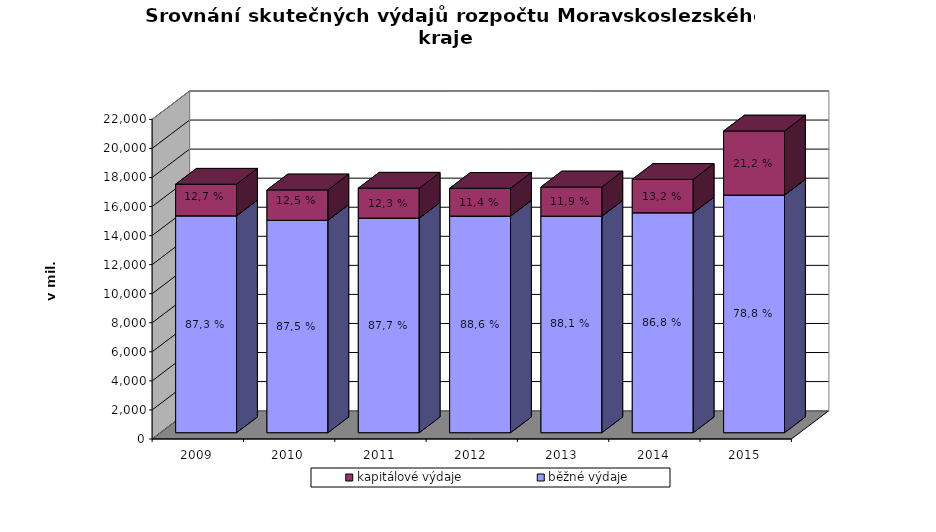
| Category | běžné výdaje | kapitálové výdaje |
|---|---|---|
| 2009.0 | 14927.606 | 2177.358 |
| 2010.0 | 14619.688 | 2091.182 |
| 2011.0 | 14769.003 | 2062.28 |
| 2012.0 | 14909.261 | 1912.375 |
| 2013.0 | 14904.712 | 2009.296 |
| 2014.0 | 15138.14 | 2299.407 |
| 2015.0 | 16356.738 | 4409.991 |